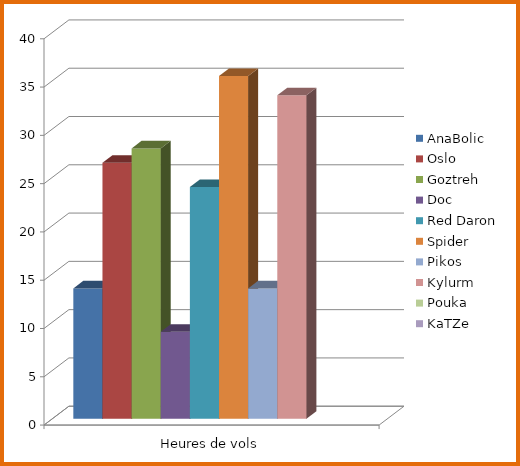
| Category | AnaBolic | Oslo | Goztreh | Doc | Red Daron | Spider | Pikos | Kylurm | Pouka | KaTZe |
|---|---|---|---|---|---|---|---|---|---|---|
| 0 | 13.5 | 26.5 | 28 | 9 | 24 | 35.5 | 13.5 | 33.5 |  |  |